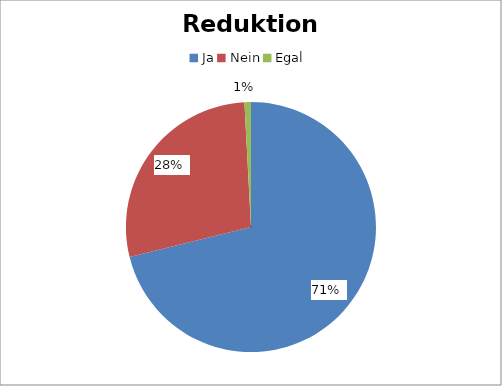
| Category | Series 0 |
|---|---|
| Ja | 254 |
| Nein | 100 |
| Egal | 3 |